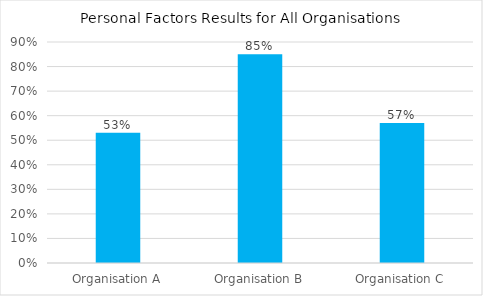
| Category | Personal Factors |
|---|---|
| Organisation A | 0.53 |
| Organisation B | 0.85 |
| Organisation C | 0.57 |